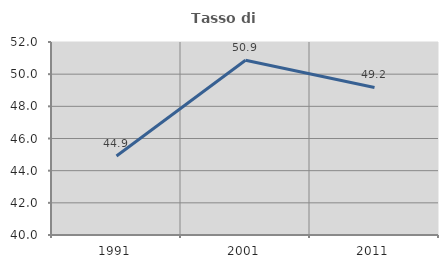
| Category | Tasso di occupazione   |
|---|---|
| 1991.0 | 44.911 |
| 2001.0 | 50.868 |
| 2011.0 | 49.172 |